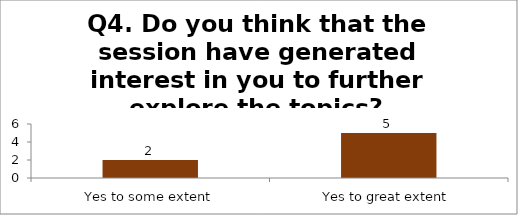
| Category | Q4. Do you think that the session have generated interest in you to further explore the topics? |
|---|---|
| Yes to some extent | 2 |
| Yes to great extent | 5 |